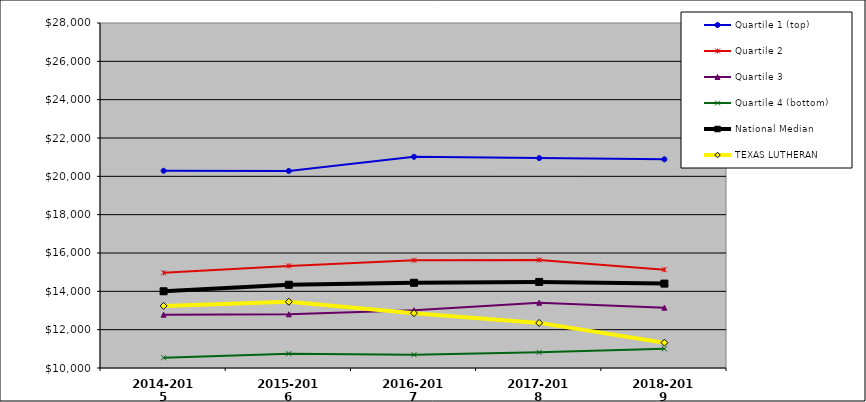
| Category | Quartile 1 (top) | Quartile 2 | Quartile 3 | Quartile 4 (bottom) | National Median |  TEXAS LUTHERAN  |
|---|---|---|---|---|---|---|
| 2014-2015 | 20290.432 | 14967.528 | 12780.096 | 10538.131 | 14002.887 | 13239.91 |
| 2015-2016 | 20280.447 | 15326.763 | 12800.355 | 10748.555 | 14342.086 | 13456.186 |
| 2016-2017 | 21018.681 | 15616.916 | 13013.102 | 10692.542 | 14445.621 | 12861.172 |
| 2017-2018 | 20950.854 | 15639.818 | 13405.787 | 10817.221 | 14489.448 | 12353.524 |
| 2018-2019 | 20886.919 | 15127.667 | 13146.203 | 10998.972 | 14402.238 | 11322.153 |